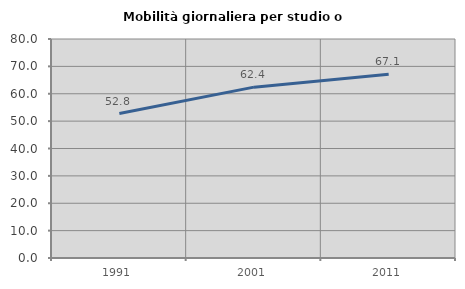
| Category | Mobilità giornaliera per studio o lavoro |
|---|---|
| 1991.0 | 52.77 |
| 2001.0 | 62.415 |
| 2011.0 | 67.102 |